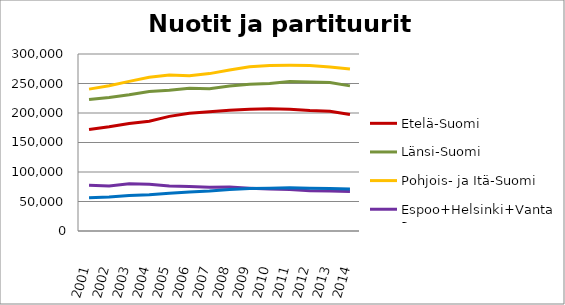
| Category | Etelä-Suomi | Länsi-Suomi | Pohjois- ja Itä-Suomi | Espoo+Helsinki+Vantaa | Muu Uusimaa |
|---|---|---|---|---|---|
| 2001.0 | 172029 | 222834 | 240491 | 77624 | 56262 |
| 2002.0 | 176601 | 226408 | 246046 | 76279 | 57562 |
| 2003.0 | 182221 | 231095 | 253568 | 80241 | 60062 |
| 2004.0 | 185920 | 236583 | 260635 | 79212 | 61594 |
| 2005.0 | 194303 | 238384 | 264367 | 76167 | 64076 |
| 2006.0 | 199472 | 241892 | 263077 | 75369 | 66279 |
| 2007.0 | 202216 | 241221 | 266756 | 74114 | 67861 |
| 2008.0 | 204790 | 245611 | 272787 | 74369 | 70350 |
| 2009.0 | 206344 | 248920 | 278456 | 72409 | 71918 |
| 2010.0 | 207097 | 249901 | 280590 | 71104 | 72301 |
| 2011.0 | 206155 | 253315 | 280947 | 70288 | 73242 |
| 2012.0 | 204054 | 252565 | 280634 | 68197 | 72588 |
| 2013.0 | 203056 | 251597 | 278032 | 67745 | 72038 |
| 2014.0 | 197369 | 245980 | 274561 | 66780 | 71329 |